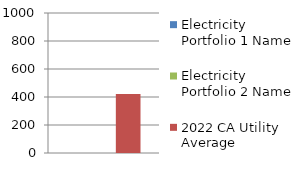
| Category | Electricity Portfolio 1 Name | Electricity Portfolio 2 Name | 2022 CA Utility Average |
|---|---|---|---|
| 0 | 0 | 0 | 422 |